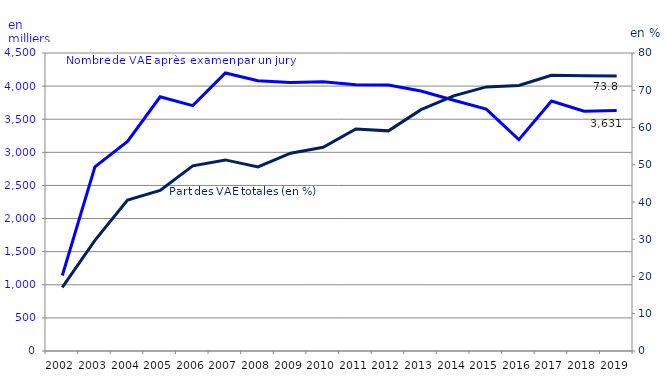
| Category | Nombre de VAE après examen par un jury |
|---|---|
| 2002.0 | 1140 |
| 2003.0 | 2780 |
| 2004.0 | 3165 |
| 2005.0 | 3838 |
| 2006.0 | 3705 |
| 2007.0 | 4199 |
| 2008.0 | 4081 |
| 2009.0 | 4055 |
| 2010.0 | 4064 |
| 2011.0 | 4019 |
| 2012.0 | 4016 |
| 2013.0 | 3925 |
| 2014.0 | 3787 |
| 2015.0 | 3653 |
| 2016.0 | 3192 |
| 2017.0 | 3774 |
| 2018.0 | 3621 |
| 2019.0 | 3631 |